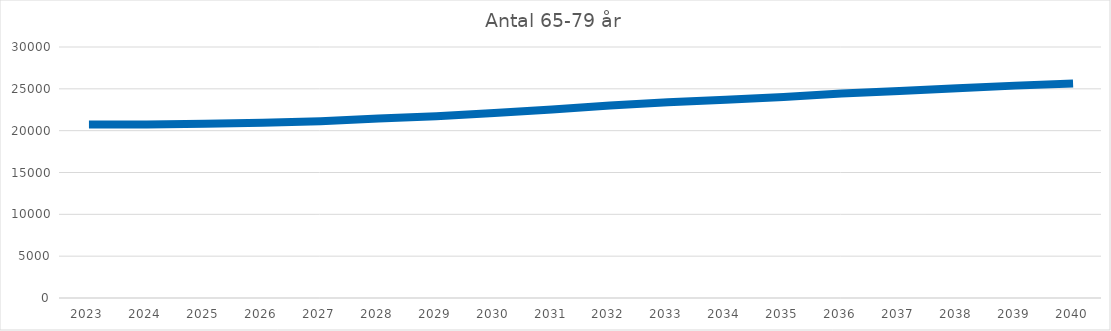
| Category | Antal 65-79 år |
|---|---|
| 2023.0 | 20730 |
| 2024.0 | 20746.706 |
| 2025.0 | 20823.166 |
| 2026.0 | 20936.343 |
| 2027.0 | 21123.645 |
| 2028.0 | 21441.556 |
| 2029.0 | 21728.758 |
| 2030.0 | 22103.302 |
| 2031.0 | 22540.679 |
| 2032.0 | 22997.778 |
| 2033.0 | 23389.856 |
| 2034.0 | 23693.853 |
| 2035.0 | 24019.843 |
| 2036.0 | 24443.682 |
| 2037.0 | 24755.058 |
| 2038.0 | 25075.451 |
| 2039.0 | 25383.541 |
| 2040.0 | 25639.475 |